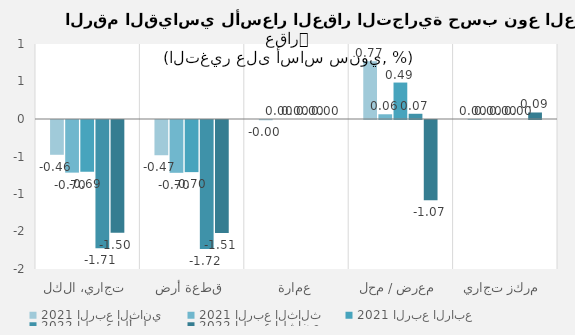
| Category | 2021 الربع الثاني | 2021 الربع الثالث | 2021 الربع الرابع | 2022 الربع الأول | 2022 الربع الثاني |
|---|---|---|---|---|---|
| تجاري، الكل | -0.464 | -0.702 | -0.69 | -1.712 | -1.503 |
| قطعة أرض | -0.47 | -0.704 | -0.695 | -1.721 | -1.507 |
| عمارة | -0.004 | 0 | 0 | 0 | 0 |
| معرض / محل | 0.77 | 0.063 | 0.486 | 0.07 | -1.072 |
| مركز تجاري | 0.002 | 0 | 0 | 0 | 0.087 |